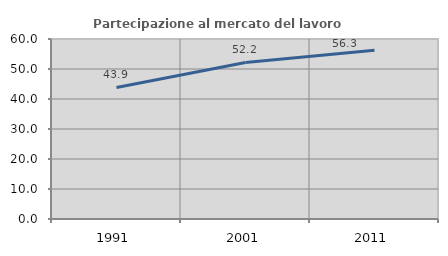
| Category | Partecipazione al mercato del lavoro  femminile |
|---|---|
| 1991.0 | 43.865 |
| 2001.0 | 52.188 |
| 2011.0 | 56.262 |